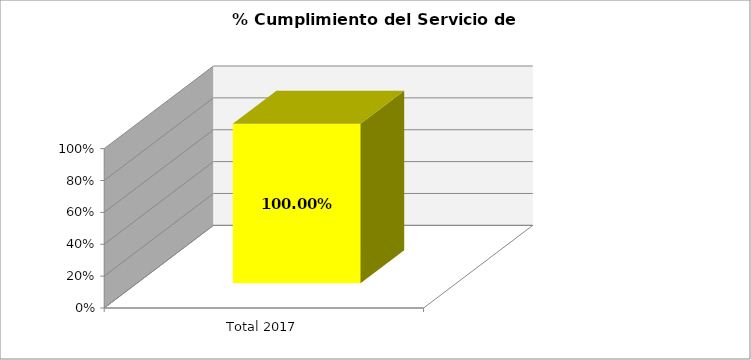
| Category | % |
|---|---|
| Total 2017 | 1 |